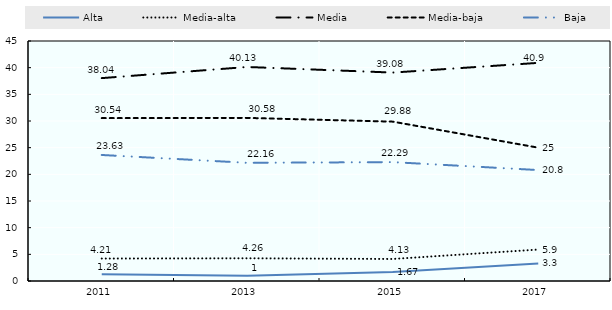
| Category | Alta | Media-alta | Media | Media-baja | Baja |
|---|---|---|---|---|---|
| 2011.0 | 1.28 | 4.21 | 38.04 | 30.54 | 23.63 |
| 2013.0 | 1 | 4.26 | 40.13 | 30.58 | 22.16 |
| 2015.0 | 1.67 | 4.13 | 39.08 | 29.88 | 22.29 |
| 2017.0 | 3.3 | 5.9 | 40.9 | 25 | 20.8 |